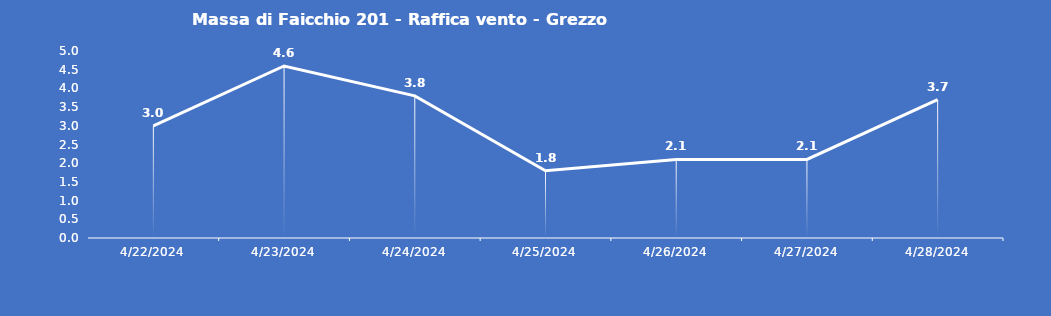
| Category | Massa di Faicchio 201 - Raffica vento - Grezzo (m/s) |
|---|---|
| 4/22/24 | 3 |
| 4/23/24 | 4.6 |
| 4/24/24 | 3.8 |
| 4/25/24 | 1.8 |
| 4/26/24 | 2.1 |
| 4/27/24 | 2.1 |
| 4/28/24 | 3.7 |